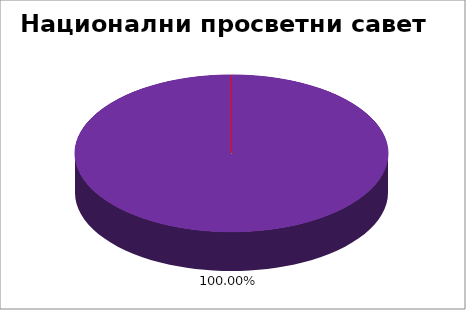
| Category | Национални просветни савет  |
|---|---|
| 0 | 0 |
| 1 | 0 |
| 2 | 0 |
| 3 | 0 |
| 4 | 1 |